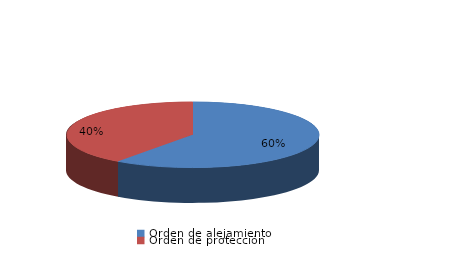
| Category | Series 0 |
|---|---|
| Orden de alejamiento | 3 |
| Orden de protección | 2 |